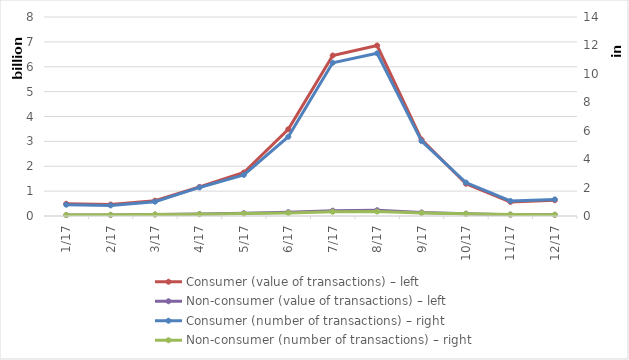
| Category | Consumer (value of transactions) – left | Non-consumer (value of transactions) – left |
|---|---|---|
| 2017-01-01 | 492081315 | 37249353 |
| 2017-02-01 | 461263724 | 42217102 |
| 2017-03-01 | 616398269 | 59069333 |
| 2017-04-01 | 1166778438 | 76692532 |
| 2017-05-01 | 1747159381 | 110939301 |
| 2017-06-01 | 3487744029 | 152531058 |
| 2017-07-01 | 6453017968 | 213748355 |
| 2017-08-01 | 6854358664 | 232179441 |
| 2017-09-01 | 3073063422 | 142681341 |
| 2017-10-01 | 1296508331 | 93842122 |
| 2017-11-01 | 565697020 | 55261202 |
| 2017-12-01 | 633340182 | 48213427 |